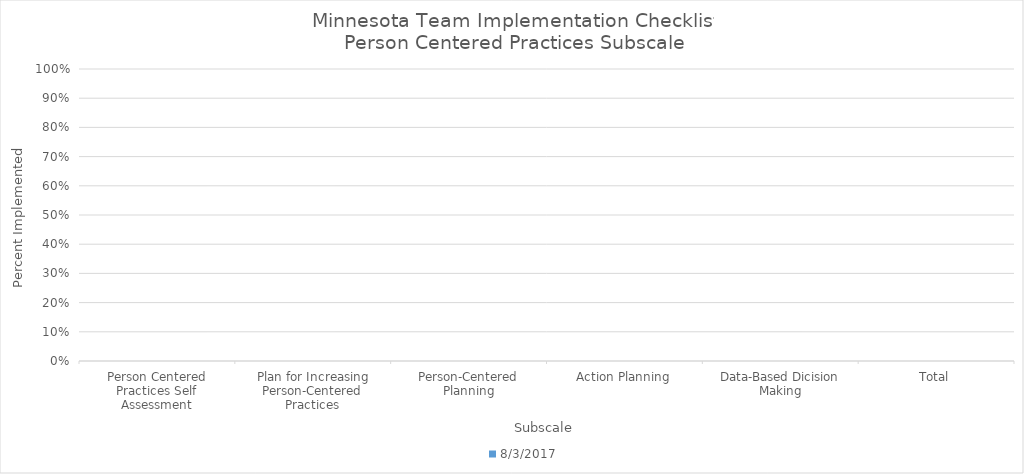
| Category | 8/3/17 |
|---|---|
| Person Centered Practices Self Assessment | 0 |
| Plan for Increasing Person-Centered Practices | 0 |
| Person-Centered Planning | 0 |
| Action Planning | 0 |
| Data-Based Dicision Making | 0 |
| Total | 0 |